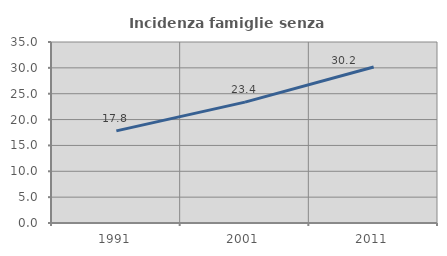
| Category | Incidenza famiglie senza nuclei |
|---|---|
| 1991.0 | 17.814 |
| 2001.0 | 23.37 |
| 2011.0 | 30.158 |